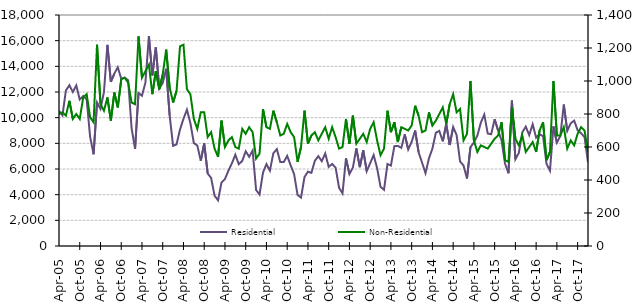
| Category | Residential |
|---|---|
| 2005-04-01 | 10540 |
| 2005-05-01 | 10180 |
| 2005-06-01 | 12120 |
| 2005-07-01 | 12530 |
| 2005-08-01 | 12000 |
| 2005-09-01 | 12510 |
| 2005-10-01 | 11410 |
| 2005-11-01 | 11690 |
| 2005-12-01 | 11430 |
| 2006-01-01 | 8500 |
| 2006-02-01 | 7150 |
| 2006-03-01 | 11180 |
| 2006-04-01 | 10690 |
| 2006-05-01 | 11990 |
| 2006-06-01 | 15670 |
| 2006-07-01 | 12790 |
| 2006-08-01 | 13430 |
| 2006-09-01 | 13930 |
| 2006-10-01 | 13030 |
| 2006-11-01 | 13120 |
| 2006-12-01 | 12920 |
| 2007-01-01 | 9170 |
| 2007-02-01 | 7580 |
| 2007-03-01 | 11920 |
| 2007-04-01 | 11700 |
| 2007-05-01 | 12750 |
| 2007-06-01 | 16360 |
| 2007-07-01 | 13290 |
| 2007-08-01 | 15480 |
| 2007-09-01 | 12270 |
| 2007-10-01 | 12700 |
| 2007-11-01 | 13810 |
| 2007-12-01 | 10180 |
| 2008-01-01 | 7800 |
| 2008-02-01 | 7920 |
| 2008-03-01 | 9080 |
| 2008-04-01 | 9910 |
| 2008-05-01 | 10620 |
| 2008-06-01 | 9580 |
| 2008-07-01 | 8020 |
| 2008-08-01 | 7830 |
| 2008-09-01 | 6650 |
| 2008-10-01 | 8000 |
| 2008-11-01 | 5650 |
| 2008-12-01 | 5300 |
| 2009-01-01 | 3920 |
| 2009-02-01 | 3560 |
| 2009-03-01 | 4950 |
| 2009-04-01 | 5220 |
| 2009-05-01 | 5870 |
| 2009-06-01 | 6440 |
| 2009-07-01 | 7110 |
| 2009-08-01 | 6370 |
| 2009-09-01 | 6630 |
| 2009-10-01 | 7380 |
| 2009-11-01 | 6950 |
| 2009-12-01 | 7440 |
| 2010-01-01 | 4370 |
| 2010-02-01 | 4010 |
| 2010-03-01 | 5720 |
| 2010-04-01 | 6380 |
| 2010-05-01 | 5870 |
| 2010-06-01 | 7230 |
| 2010-07-01 | 7550 |
| 2010-08-01 | 6540 |
| 2010-09-01 | 6540 |
| 2010-10-01 | 7020 |
| 2010-11-01 | 6290 |
| 2010-12-01 | 5600 |
| 2011-01-01 | 3980 |
| 2011-02-01 | 3770 |
| 2011-03-01 | 5370 |
| 2011-04-01 | 5790 |
| 2011-05-01 | 5700 |
| 2011-06-01 | 6640 |
| 2011-07-01 | 7000 |
| 2011-08-01 | 6610 |
| 2011-09-01 | 7210 |
| 2011-10-01 | 6170 |
| 2011-11-01 | 6390 |
| 2011-12-01 | 6110 |
| 2012-01-01 | 4540 |
| 2012-02-01 | 4100 |
| 2012-03-01 | 6830 |
| 2012-04-01 | 5610 |
| 2012-05-01 | 6110 |
| 2012-06-01 | 7600 |
| 2012-07-01 | 6140 |
| 2012-08-01 | 7460 |
| 2012-09-01 | 5830 |
| 2012-10-01 | 6450 |
| 2012-11-01 | 7090 |
| 2012-12-01 | 6070 |
| 2013-01-01 | 4610 |
| 2013-02-01 | 4380 |
| 2013-03-01 | 6390 |
| 2013-04-01 | 6270 |
| 2013-05-01 | 7780 |
| 2013-06-01 | 7800 |
| 2013-07-01 | 7650 |
| 2013-08-01 | 8700 |
| 2013-09-01 | 7520 |
| 2013-10-01 | 8110 |
| 2013-11-01 | 9000 |
| 2013-12-01 | 7310 |
| 2014-01-01 | 6500 |
| 2014-02-01 | 5680 |
| 2014-03-01 | 6830 |
| 2014-04-01 | 7590 |
| 2014-05-01 | 8830 |
| 2014-06-01 | 8970 |
| 2014-07-01 | 8160 |
| 2014-08-01 | 9500 |
| 2014-09-01 | 7870 |
| 2014-10-01 | 9270 |
| 2014-11-01 | 8640 |
| 2014-12-01 | 6590 |
| 2015-01-01 | 6270 |
| 2015-02-01 | 5260 |
| 2015-03-01 | 7700 |
| 2015-04-01 | 8060 |
| 2015-05-01 | 8600 |
| 2015-06-01 | 9610 |
| 2015-07-01 | 10240 |
| 2015-08-01 | 8760 |
| 2015-09-01 | 8710 |
| 2015-10-01 | 9880 |
| 2015-11-01 | 9000 |
| 2015-12-01 | 8230 |
| 2016-01-01 | 6430 |
| 2016-02-01 | 5670 |
| 2016-03-01 | 11330 |
| 2016-04-01 | 6760 |
| 2016-05-01 | 7260 |
| 2016-06-01 | 8860 |
| 2016-07-01 | 9300 |
| 2016-08-01 | 8640 |
| 2016-09-01 | 9490 |
| 2016-10-01 | 8440 |
| 2016-11-01 | 8710 |
| 2016-12-01 | 8560 |
| 2017-01-01 | 6400 |
| 2017-02-01 | 5860 |
| 2017-03-01 | 9320 |
| 2017-04-01 | 8050 |
| 2017-05-01 | 8570 |
| 2017-06-01 | 11020 |
| 2017-07-01 | 8970 |
| 2017-08-01 | 9560 |
| 2017-09-01 | 9770 |
| 2017-10-01 | 9020 |
| 2017-11-01 | 8790 |
| 2017-12-01 | 8490 |
| 2018-01-01 | 6510 |